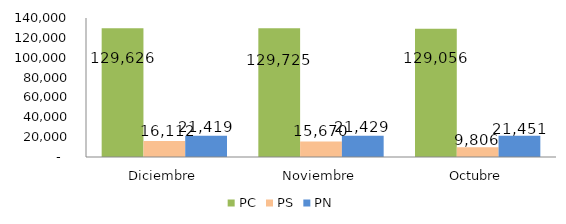
| Category | PC | PS | PN |
|---|---|---|---|
| Diciembre | 129626 | 16112 | 21419 |
| Noviembre | 129725 | 15670 | 21429 |
| Octubre | 129056 | 9806 | 21451 |